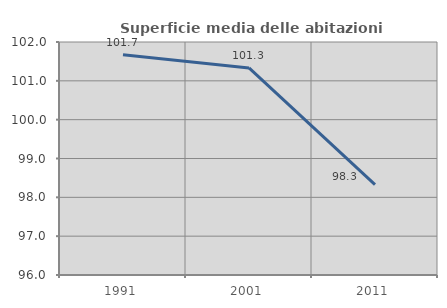
| Category | Superficie media delle abitazioni occupate |
|---|---|
| 1991.0 | 101.673 |
| 2001.0 | 101.332 |
| 2011.0 | 98.328 |